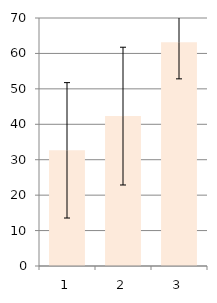
| Category | Series 0 |
|---|---|
| 0 | 32.653 |
| 1 | 42.308 |
| 2 | 63.132 |